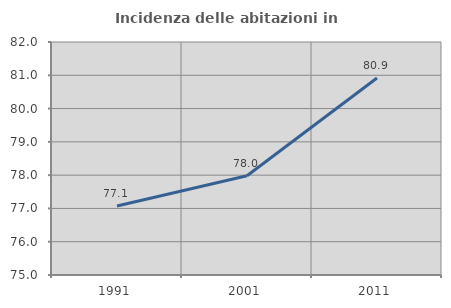
| Category | Incidenza delle abitazioni in proprietà  |
|---|---|
| 1991.0 | 77.073 |
| 2001.0 | 77.98 |
| 2011.0 | 80.919 |